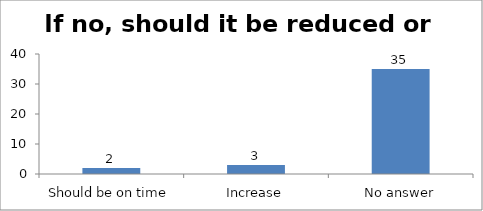
| Category | If no, should it be reduced or increased |
|---|---|
| Should be on time | 2 |
| Increase | 3 |
| No answer | 35 |